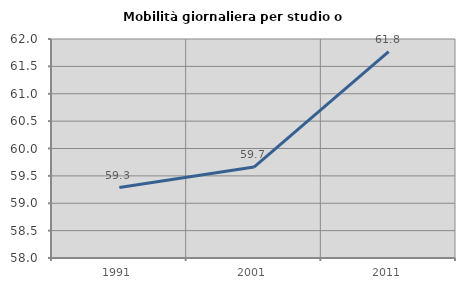
| Category | Mobilità giornaliera per studio o lavoro |
|---|---|
| 1991.0 | 59.286 |
| 2001.0 | 59.662 |
| 2011.0 | 61.771 |